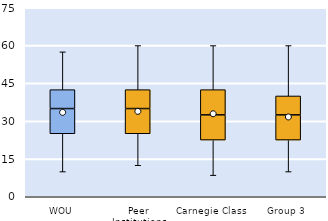
| Category | 25th | 50th | 75th |
|---|---|---|---|
| WOU | 25 | 10 | 7.5 |
| Peer Institutions | 25 | 10 | 7.5 |
| Carnegie Class | 22.5 | 10 | 10 |
| Group 3 | 22.5 | 10 | 7.5 |